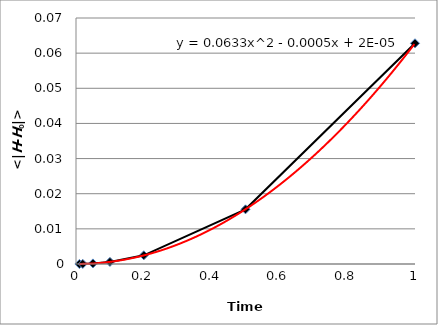
| Category | Series 0 |
|---|---|
| 0.01 | 0 |
| 0.02 | 0 |
| 0.05 | 0 |
| 0.1 | 0.001 |
| 0.2 | 0.002 |
| 0.5 | 0.016 |
| 1.0 | 0.063 |